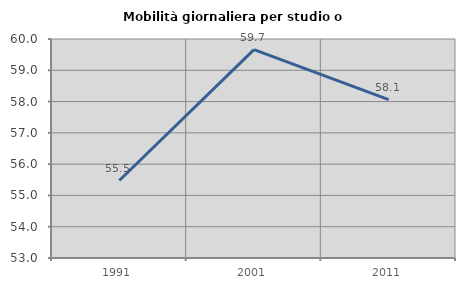
| Category | Mobilità giornaliera per studio o lavoro |
|---|---|
| 1991.0 | 55.477 |
| 2001.0 | 59.662 |
| 2011.0 | 58.065 |